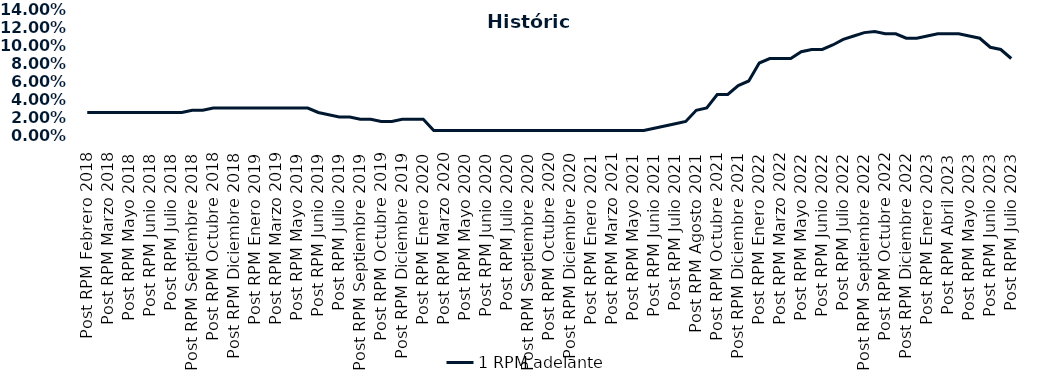
| Category | 1 RPM adelante |
|---|---|
| Post RPM Febrero 2018 | 0.025 |
| Pre RPM Marzo 2018 | 0.025 |
| Post RPM Marzo 2018 | 0.025 |
| Pre RPM Mayo 2018 | 0.025 |
| Post RPM Mayo 2018 | 0.025 |
| Pre RPM Junio 2018 | 0.025 |
| Post RPM Junio 2018 | 0.025 |
| Pre RPM Julio 2018 | 0.025 |
| Post RPM Julio 2018 | 0.025 |
| Pre RPM Septiembre 2018 | 0.025 |
| Post RPM Septiembre 2018 | 0.028 |
| Pre RPM Octubre 2018 | 0.028 |
| Post RPM Octubre 2018 | 0.03 |
| Pre RPM Diciembre 2018 | 0.03 |
| Post RPM Diciembre 2018 | 0.03 |
| Pre RPM Enero 2019 | 0.03 |
| Post RPM Enero 2019 | 0.03 |
| Pre RPM Marzo 2019 | 0.03 |
| Post RPM Marzo 2019 | 0.03 |
| Pre RPM Mayo 2019 | 0.03 |
| Post RPM Mayo 2019 | 0.03 |
| Pre RPM Junio 2019 | 0.03 |
| Post RPM Junio 2019 | 0.025 |
| Pre RPM Julio 2019 | 0.022 |
| Post RPM Julio 2019 | 0.02 |
| Pre RPM Septiembre 2019 | 0.02 |
| Post RPM Septiembre 2019 | 0.018 |
| Pre RPM Octubre 2019 | 0.018 |
| Post RPM Octubre 2019 | 0.015 |
| Pre RPM Diciembre 2019 | 0.015 |
| Post RPM Diciembre 2019 | 0.018 |
| Pre RPM Enero 2020 | 0.018 |
| Post RPM Enero 2020 | 0.018 |
| Pre RPM Marzo 2020 | 0.005 |
| Post RPM Marzo 2020 | 0.005 |
| Pre RPM Mayo 2020 | 0.005 |
| Post RPM Mayo 2020 | 0.005 |
| Pre RPM Junio 2020 | 0.005 |
| Post RPM Junio 2020 | 0.005 |
| Pre RPM Julio 2020 | 0.005 |
| Post RPM Julio 2020 | 0.005 |
| Pre RPM Septiembre 2020 | 0.005 |
| Post RPM Septiembre 2020 | 0.005 |
| Pre RPM Octubre 2020 | 0.005 |
| Post RPM Octubre 2020 | 0.005 |
| Pre RPM Diciembre 2020 | 0.005 |
| Post RPM Diciembre 2020 | 0.005 |
| Pre RPM Enero 2021 | 0.005 |
| Post RPM Enero 2021 | 0.005 |
| Pre RPM Marzo 2021 | 0.005 |
| Post RPM Marzo 2021 | 0.005 |
| Pre RPM Mayo 2021 | 0.005 |
| Post RPM Mayo 2021 | 0.005 |
| Pre RPM Junio 2021 | 0.005 |
| Post RPM Junio 2021 | 0.008 |
| Pre RPM Julio 2021 | 0.01 |
| Post RPM Julio 2021 | 0.012 |
| Pre RPM Agosto 2021 | 0.015 |
| Post RPM Agosto 2021 | 0.028 |
| Pre RPM Octubre 2021 | 0.03 |
| Post RPM Octubre 2021 | 0.045 |
| Pre RPM Diciembre 2021 | 0.045 |
| Post RPM Diciembre 2021 | 0.055 |
| Pre RPM Enero 2022 | 0.06 |
| Post RPM Enero 2022 | 0.08 |
| Pre RPM Marzo 2022 | 0.085 |
| Post RPM Marzo 2022 | 0.085 |
| Pre RPM Mayo 2022 | 0.085 |
| Post RPM Mayo 2022 | 0.092 |
| Pre RPM Junio 2022 | 0.095 |
| Post RPM Junio 2022 | 0.095 |
| Pre RPM Julio 2022 | 0.1 |
| Post RPM Julio 2022 | 0.106 |
| Pre RPM Septiembre 2022 | 0.11 |
| Post RPM Septiembre 2022 | 0.114 |
| Pre RPM Octubre 2022 | 0.115 |
| Post RPM Octubre 2022 | 0.112 |
| Pre RPM Diciembre 2022 | 0.112 |
| Post RPM Diciembre 2022 | 0.108 |
| Pre RPM Enero 2023 | 0.108 |
| Post RPM Enero 2023 | 0.11 |
| Pre RPM Abril 2023 | 0.112 |
| Post RPM Abril 2023 | 0.112 |
| Pre RPM Mayo 2023 | 0.112 |
| Post RPM Mayo 2023 | 0.11 |
| Pre RPM Junio 2023 | 0.108 |
| Post RPM Junio 2023 | 0.098 |
| Pre RPM Julio 2023 | 0.095 |
| Post RPM Julio 2023 | 0.085 |